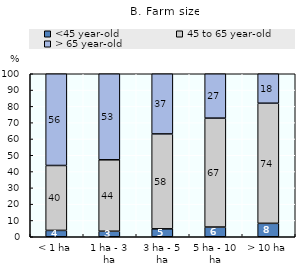
| Category | <45 year-old | 45 to 65 year-old | > 65 year-old |
|---|---|---|---|
| < 1 ha | 3.901 | 39.821 | 56.278 |
| 1 ha - 3 ha | 3.388 | 43.829 | 52.783 |
| 3 ha - 5 ha | 4.859 | 58.23 | 36.911 |
| 5 ha - 10 ha | 5.959 | 66.82 | 27.221 |
| > 10 ha | 8.233 | 73.69 | 18.076 |